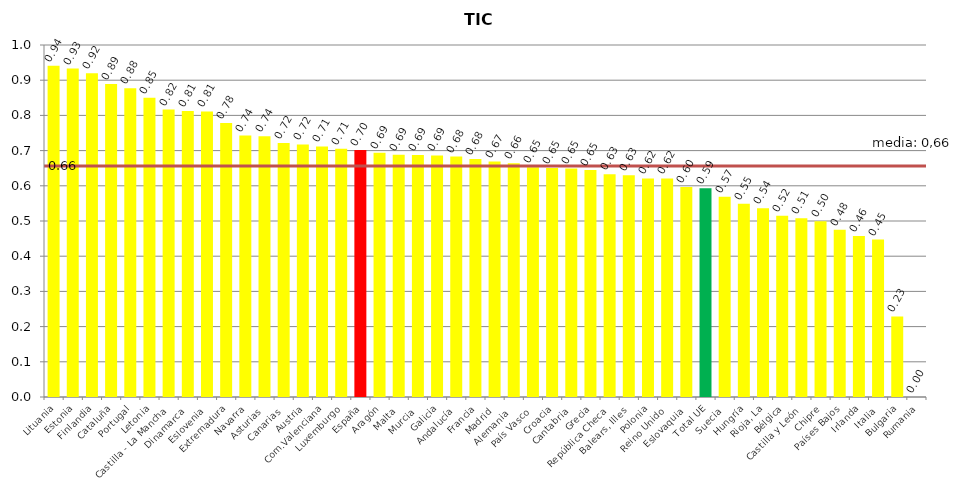
| Category | Series 0 |
|---|---|
| Lituania | 0.941 |
| Estonia | 0.933 |
| Finlandia | 0.92 |
| Cataluña | 0.889 |
| Portugal | 0.877 |
| Letonia | 0.85 |
| Castilla - La Mancha | 0.817 |
| Dinamarca | 0.812 |
| Eslovenia | 0.811 |
| Extremadura | 0.778 |
| Navarra | 0.743 |
| Asturias | 0.741 |
| Canarias | 0.722 |
| Austria | 0.717 |
| Com.Valenciana | 0.712 |
| Luxemburgo | 0.705 |
| España | 0.701 |
| Aragón | 0.694 |
| Malta | 0.688 |
| Murcia | 0.687 |
| Galicia | 0.686 |
| Andalucía | 0.683 |
| Francia | 0.676 |
| Madrid | 0.669 |
| Alemania  | 0.664 |
| País Vasco | 0.653 |
| Croacia | 0.65 |
| Cantabria | 0.649 |
| Grecia | 0.645 |
| República Checa | 0.633 |
| Balears, Illes | 0.63 |
| Polonia | 0.621 |
| Reino Unido | 0.621 |
| Eslovaquia | 0.597 |
| Total UE | 0.593 |
| Suecia | 0.569 |
| Hungría | 0.549 |
| Rioja, La | 0.536 |
| Bélgica | 0.515 |
| Castilla y León | 0.508 |
| Chipre | 0.499 |
| Países Bajos | 0.475 |
| Irlanda | 0.458 |
| Italia | 0.447 |
| Bulgaria | 0.229 |
| Rumania | 0 |